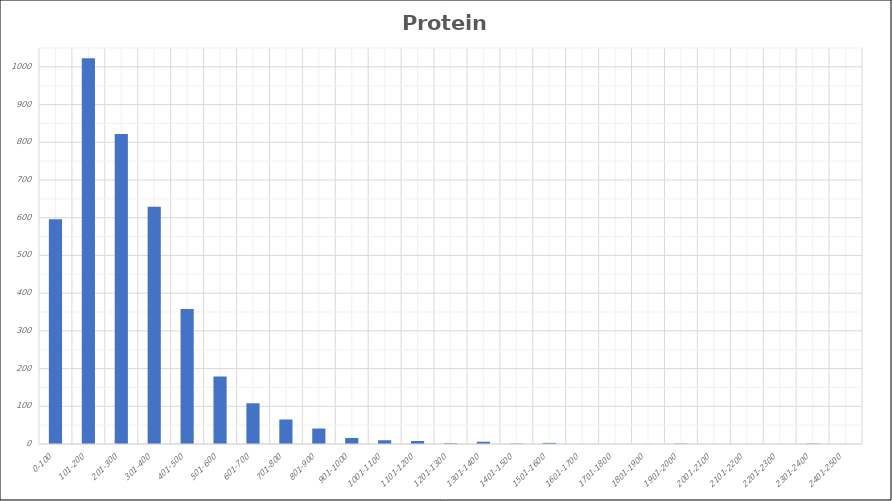
| Category | Series 0 |
|---|---|
| 0-100 | 596 |
| 101-200 | 1023 |
| 201-300 | 822 |
| 301-400 | 629 |
| 401-500 | 358 |
| 501-600 | 179 |
| 601-700 | 108 |
| 701-800 | 65 |
| 801-900 | 41 |
| 901-1000 | 16 |
| 1001-1100 | 10 |
| 1101-1200 | 8 |
| 1201-1300 | 2 |
| 1301-1400 | 6 |
| 1401-1500 | 1 |
| 1501-1600 | 3 |
| 1601-1700 | 0 |
| 1701-1800 | 0 |
| 1801-1900 | 0 |
| 1901-2000 | 1 |
| 2001-2100 | 0 |
| 2101-2200 | 0 |
| 2201-2300 | 0 |
| 2301-2400 | 1 |
| 2401-2500 | 0 |